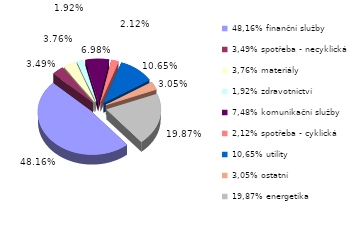
| Category | Series 0 |
|---|---|
| 48,16% finanční služby | 0.482 |
| 3,49% spotřeba - necyklická | 0.035 |
| 3,76% materiály | 0.038 |
| 1,92% zdravotnictví | 0.019 |
| 7,48% komunikační služby | 0.07 |
| 2,12% spotřeba - cyklická | 0.021 |
| 10,65% utility | 0.106 |
| 3,05% ostatní | 0.03 |
| 19,87% energetika | 0.199 |